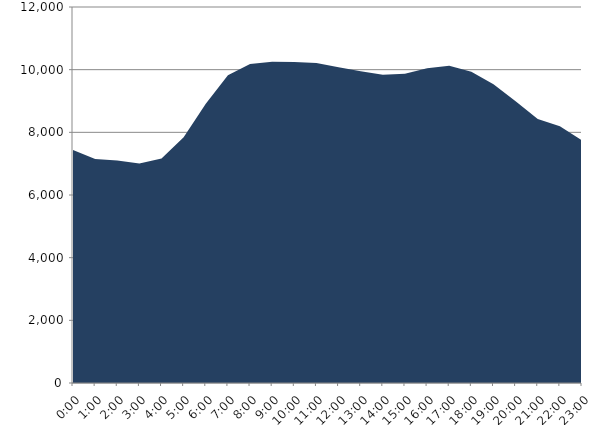
| Category | Series 0 | Series 1 |
|---|---|---|
| 2023-12-20 |  | 7436.53 |
| 2023-12-20 01:00:00 |  | 7152.01 |
| 2023-12-20 02:00:00 |  | 7102.3 |
| 2023-12-20 03:00:00 |  | 7006.46 |
| 2023-12-20 04:00:00 |  | 7162.52 |
| 2023-12-20 05:00:00 |  | 7843.94 |
| 2023-12-20 06:00:00 |  | 8913.51 |
| 2023-12-20 07:00:00 |  | 9824.4 |
| 2023-12-20 08:00:00 |  | 10177.3 |
| 2023-12-20 09:00:00 |  | 10249.8 |
| 2023-12-20 10:00:00 |  | 10244.92 |
| 2023-12-20 11:00:00 |  | 10212.24 |
| 2023-12-20 12:00:00 |  | 10079.13 |
| 2023-12-20 13:00:00 |  | 9948.09 |
| 2023-12-20 14:00:00 |  | 9833.89 |
| 2023-12-20 15:00:00 |  | 9868.46 |
| 2023-12-20 16:00:00 |  | 10043.75 |
| 2023-12-20 17:00:00 |  | 10122.6 |
| 2023-12-20 18:00:00 |  | 9932.35 |
| 2023-12-20 19:00:00 |  | 9530.78 |
| 2023-12-20 20:00:00 |  | 8994.82 |
| 2023-12-20 21:00:00 |  | 8424.28 |
| 2023-12-20 22:00:00 |  | 8191.75 |
| 2023-12-20 23:00:00 |  | 7746.73 |